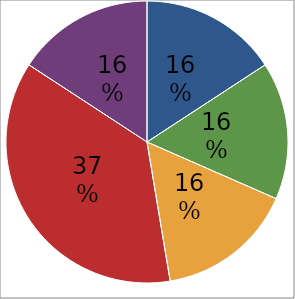
| Category | Sans titre 1 |
|---|---|
| 0 | 7500 |
| 1 | 7500 |
| 2 | 7500 |
| 3 | 17500 |
| 4 | 7500 |